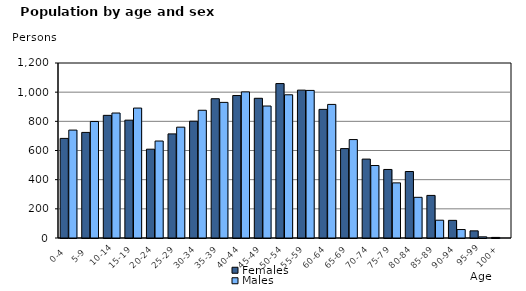
| Category | Females | Males |
|---|---|---|
|   0-4  | 683 | 740 |
|   5-9  | 724 | 799 |
| 10-14 | 841 | 857 |
| 15-19  | 808 | 891 |
| 20-24  | 609 | 665 |
| 25-29  | 714 | 760 |
| 30-34  | 801 | 876 |
| 35-39  | 955 | 930 |
| 40-44  | 977 | 1002 |
| 45-49  | 958 | 905 |
| 50-54  | 1059 | 982 |
| 55-59  | 1014 | 1012 |
| 60-64  | 882 | 916 |
| 65-69  | 613 | 675 |
| 70-74  | 541 | 497 |
| 75-79  | 470 | 378 |
| 80-84  | 456 | 279 |
| 85-89  | 292 | 122 |
| 90-94  | 121 | 58 |
| 95-99 | 49 | 8 |
| 100+ | 4 | 0 |